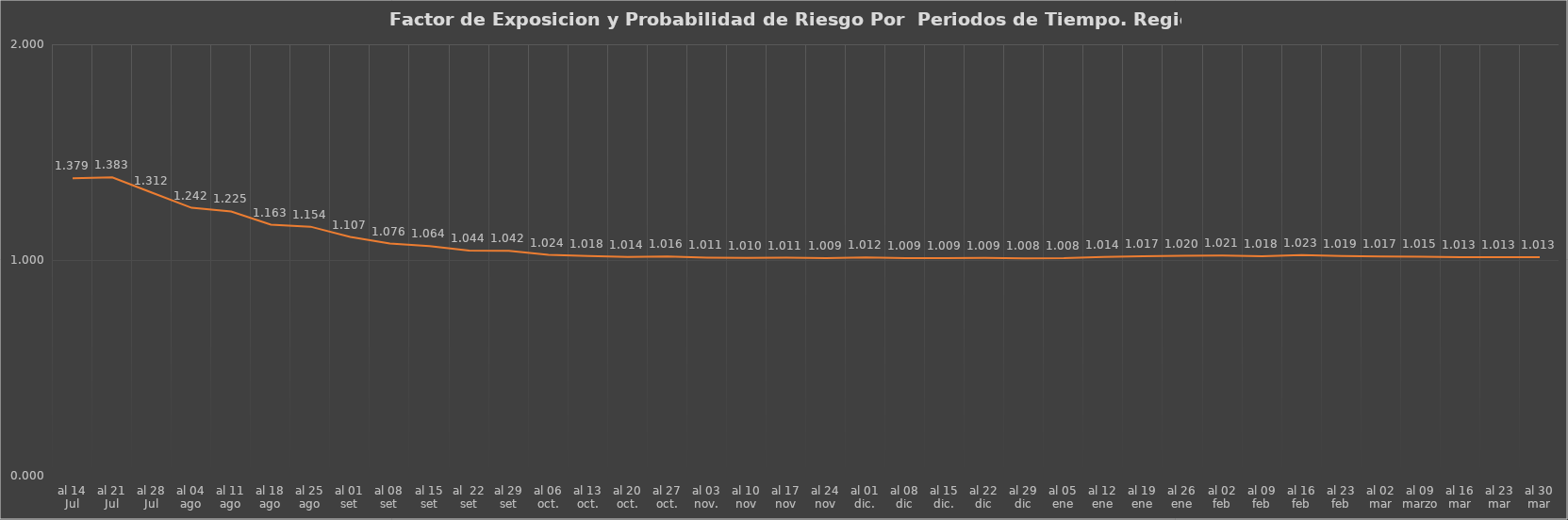
| Category | Series 1 |
|---|---|
| al 14 Jul | 1.379 |
| al 21 Jul | 1.383 |
| al 28 Jul | 1.312 |
| al 04 ago | 1.242 |
| al 11 ago | 1.225 |
| al 18 ago | 1.163 |
| al 25 ago | 1.154 |
| al 01 set | 1.107 |
| al 08 set | 1.076 |
| al 15 set | 1.064 |
| al  22 set | 1.044 |
| al 29 set | 1.042 |
| al 06 oct. | 1.024 |
| al 13 oct. | 1.018 |
| al 20 oct. | 1.014 |
| al 27 oct. | 1.016 |
| al 03 nov. | 1.011 |
| al 10 nov | 1.01 |
| al 17 nov | 1.011 |
| al 24 nov | 1.009 |
| al 01 dic. | 1.012 |
| al 08 dic | 1.009 |
| al 15 dic. | 1.009 |
| al 22 dic | 1.009 |
| al 29 dic | 1.008 |
| al 05 ene | 1.008 |
| al 12 ene | 1.014 |
| al 19 ene | 1.017 |
| al 26 ene | 1.02 |
| al 02 feb | 1.021 |
| al 09 feb | 1.018 |
| al 16 feb | 1.023 |
| al 23 feb | 1.019 |
| al 02 mar | 1.017 |
| al 09 marzo | 1.015 |
| al 16 mar | 1.013 |
| al 23 mar | 1.013 |
| al 30 mar | 1.013 |